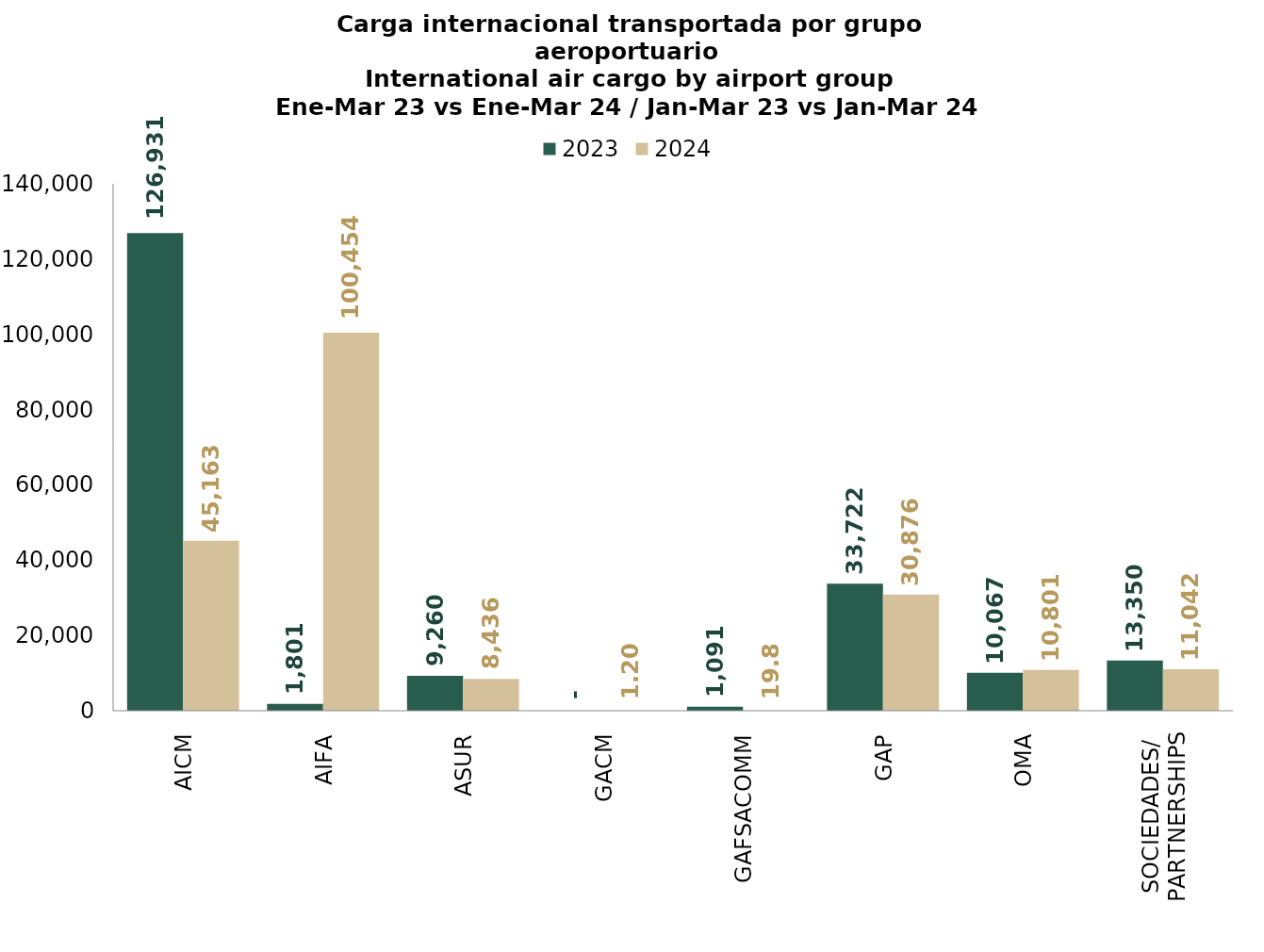
| Category | 2023 | 2024 |
|---|---|---|
| AICM | 126930.95 | 45162.6 |
| AIFA | 1800.893 | 100454.122 |
| ASUR | 9260.31 | 8436.014 |
| GACM | 0 | 1.2 |
| GAFSACOMM | 1090.65 | 19.8 |
| GAP | 33721.668 | 30875.795 |
| OMA | 10066.67 | 10800.841 |
| SOCIEDADES/
PARTNERSHIPS | 13350.352 | 11041.919 |